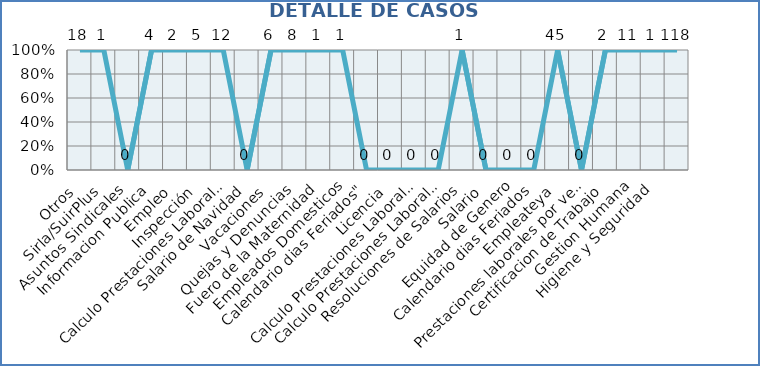
| Category | Series 0 |
|---|---|
| Otros | 18 |
| Sirla/SuirPlus | 1 |
| Asuntos Sindicales | 0 |
| Informacion Publica | 4 |
| Empleo | 2 |
| Inspección | 5 |
| Calculo Prestaciones Laborales | 12 |
| Salario de Navidad | 0 |
| Vacaciones | 6 |
| Quejas y Denuncias | 8 |
| Fuero de la Maternidad | 1 |
| Empleados Domesticos | 1 |
| Calendario dias Feriados" | 0 |
| Licencia | 0 |
| Calculo Prestaciones Laborales por quiebra empresa | 0 |
| Calculo Prestaciones Laborales por renuncia | 0 |
| Resoluciones de Salarios | 1 |
| Salario | 0 |
| Equidad de Genero | 0 |
| Calendario dias Feriados | 0 |
| Empleateya | 45 |
| Prestaciones laborales por venta empresa | 0 |
| Certificacion de Trabajo | 2 |
| Gestion Humana | 11 |
| Higiene y Seguridad | 1 |